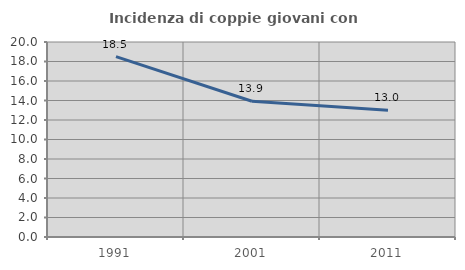
| Category | Incidenza di coppie giovani con figli |
|---|---|
| 1991.0 | 18.503 |
| 2001.0 | 13.928 |
| 2011.0 | 13.003 |